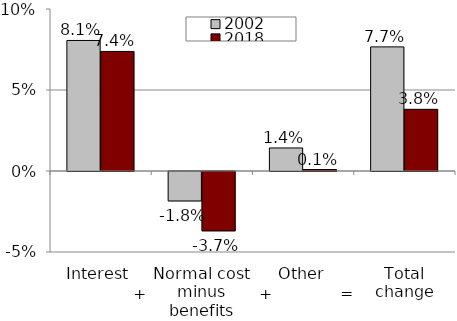
| Category | 2002 | 2018 |
|---|---|---|
| Interest | 0.081 | 0.074 |
| Normal cost minus benefits | -0.018 | -0.037 |
| Other | 0.014 | 0.001 |
| Total change | 0.077 | 0.038 |